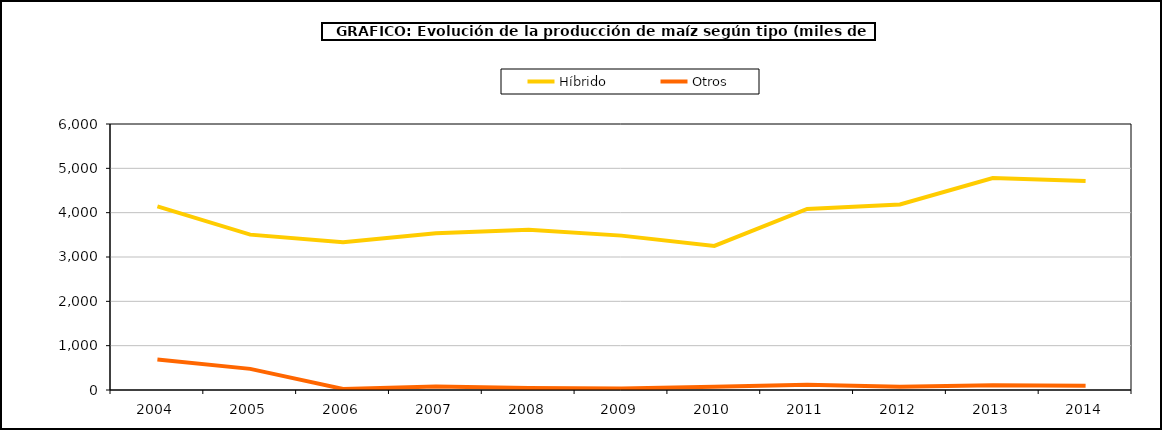
| Category | Híbrido | Otros |
|---|---|---|
| 2004 | 4142.754 | 688.393 |
| 2005 | 3504.679 | 476.691 |
| 2006 | 3332.474 | 23.248 |
| 2007 | 3534.026 | 76.911 |
| 2008 | 3615.117 | 45.316 |
| 2009 | 3482.098 | 33.519 |
| 2010 | 3250.084 | 74.737 |
| 2011 | 4084.167 | 115.76 |
| 2012 | 4186.073 | 75.996 |
| 2013 | 4779.482 | 108.979 |
| 2014 | 4715.168 | 95.477 |